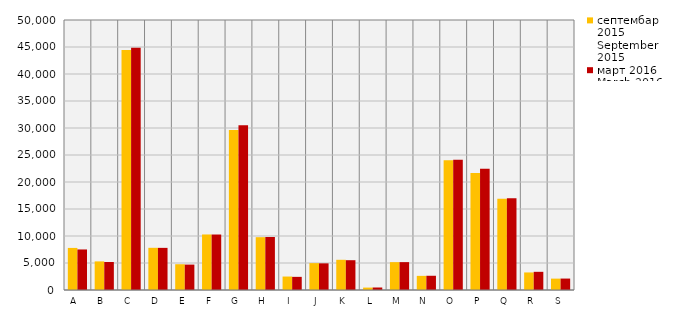
| Category | септембар 2015
September 2015 | март 2016
March 2016 |
|---|---|---|
| A  | 7791 | 7507 |
| B  | 5297 | 5183 |
| C  | 44461 | 44858 |
| D  | 7813 | 7802 |
| Е  | 4772 | 4704 |
| F  | 10282 | 10275 |
| G  | 29646 | 30505 |
| H  | 9780 | 9815 |
| I  | 2493 | 2434 |
| J  | 4977 | 4934 |
| K  | 5594 | 5518 |
| L  | 447 | 463 |
| M  | 5158 | 5161 |
| N  | 2617 | 2636 |
| O  | 24039 | 24099 |
| P  | 21644 | 22452 |
| Q  | 16884 | 16977 |
| R  | 3251 | 3367 |
| S  | 2106 | 2118 |